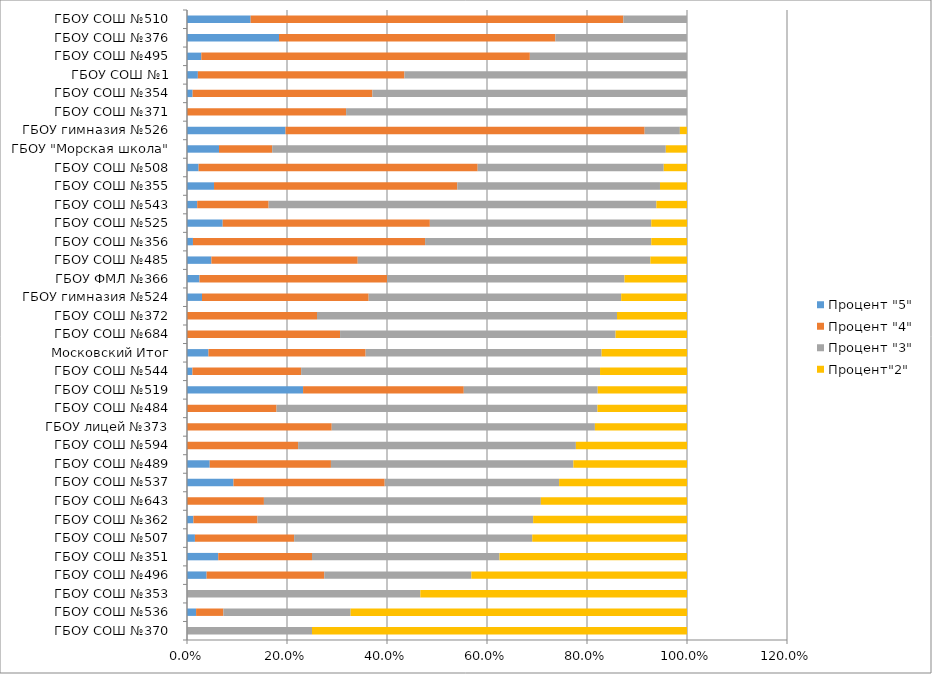
| Category | Процент "5" | Процент "4" | Процент "3" | Процент"2" |
|---|---|---|---|---|
| ГБОУ СОШ №370 | 0 | 0 | 0.25 | 0.75 |
| ГБОУ СОШ №536 | 0.018 | 0.055 | 0.255 | 0.673 |
| ГБОУ СОШ №353 | 0 | 0 | 0.467 | 0.533 |
| ГБОУ СОШ №496 | 0.039 | 0.235 | 0.294 | 0.431 |
| ГБОУ СОШ №351 | 0.062 | 0.188 | 0.375 | 0.375 |
| ГБОУ СОШ №507 | 0.016 | 0.198 | 0.476 | 0.31 |
| ГБОУ СОШ №362 | 0.013 | 0.128 | 0.551 | 0.308 |
| ГБОУ СОШ №643 | 0 | 0.154 | 0.554 | 0.292 |
| ГБОУ СОШ №537 | 0.093 | 0.302 | 0.349 | 0.256 |
| ГБОУ СОШ №489 | 0.045 | 0.242 | 0.485 | 0.227 |
| ГБОУ СОШ №594 | 0 | 0.222 | 0.556 | 0.222 |
| ГБОУ лицей №373 | 0 | 0.289 | 0.526 | 0.184 |
| ГБОУ СОШ №484 | 0 | 0.179 | 0.642 | 0.179 |
| ГБОУ СОШ №519 | 0.232 | 0.321 | 0.268 | 0.179 |
| ГБОУ СОШ №544 | 0.011 | 0.217 | 0.598 | 0.174 |
| Московский Итог | 0.043 | 0.314 | 0.472 | 0.171 |
| ГБОУ СОШ №684 | 0 | 0.306 | 0.551 | 0.143 |
| ГБОУ СОШ №372 | 0 | 0.26 | 0.6 | 0.14 |
| ГБОУ гимназия №524 | 0.03 | 0.333 | 0.505 | 0.131 |
| ГБОУ ФМЛ №366 | 0.025 | 0.375 | 0.475 | 0.125 |
| ГБОУ СОШ №485 | 0.049 | 0.293 | 0.585 | 0.073 |
| ГБОУ СОШ №356 | 0.012 | 0.464 | 0.452 | 0.071 |
| ГБОУ СОШ №525 | 0.071 | 0.414 | 0.443 | 0.071 |
| ГБОУ СОШ №543 | 0.02 | 0.143 | 0.776 | 0.061 |
| ГБОУ СОШ №355 | 0.054 | 0.486 | 0.405 | 0.054 |
| ГБОУ СОШ №508 | 0.023 | 0.558 | 0.372 | 0.047 |
| ГБОУ "Морская школа" | 0.064 | 0.106 | 0.787 | 0.043 |
| ГБОУ гимназия №526 | 0.197 | 0.718 | 0.07 | 0.014 |
| ГБОУ СОШ №371 | 0 | 0.318 | 0.682 | 0 |
| ГБОУ СОШ №354 | 0.011 | 0.36 | 0.629 | 0 |
| ГБОУ СОШ №1 | 0.022 | 0.413 | 0.565 | 0 |
| ГБОУ СОШ №495 | 0.029 | 0.657 | 0.314 | 0 |
| ГБОУ СОШ №376 | 0.184 | 0.553 | 0.263 | 0 |
| ГБОУ СОШ №510 | 0.127 | 0.745 | 0.127 | 0 |